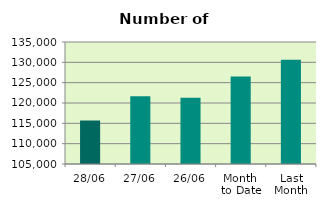
| Category | Series 0 |
|---|---|
| 28/06 | 115678 |
| 27/06 | 121668 |
| 26/06 | 121282 |
| Month 
to Date | 126531 |
| Last
Month | 130647.636 |